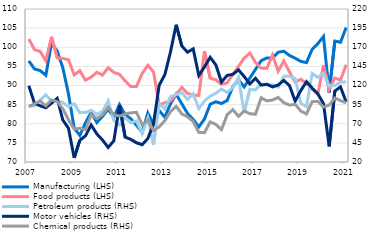
| Category | Manufacturing (LHS) | Food products (LHS) |
|---|---|---|
| 2007 | 96.427 | 102.153 |
| II | 94.327 | 99.364 |
| III | 93.9 | 98.904 |
| IV | 92.682 | 96.417 |
| 2008 | 100.969 | 102.741 |
| II | 99.031 | 97.259 |
| III | 94.635 | 97.109 |
| IV | 87.766 | 96.715 |
| 2009 | 78.923 | 92.764 |
| II | 76.927 | 93.876 |
| III | 80.273 | 91.367 |
| IV | 82.995 | 92.186 |
| 2010 | 80.321 | 93.462 |
| II | 81.929 | 92.737 |
| III | 83.822 | 94.65 |
| IV | 81.702 | 93.434 |
| 2011 | 85.031 | 92.939 |
| II | 82.353 | 91.191 |
| III | 81.307 | 89.747 |
| IV | 79.595 | 89.752 |
| 2012 | 77.737 | 93.154 |
| II | 82.81 | 95.294 |
| III | 79.836 | 93.556 |
| IV | 83.455 | 84.956 |
| 2013 | 81.697 | 85.466 |
| II | 85.208 | 85.966 |
| III | 87.729 | 87.693 |
| IV | 85.199 | 89.509 |
| 2014 | 82.71 | 87.919 |
| II | 81.127 | 87.555 |
| III | 79.166 | 87.381 |
| IV | 81.263 | 98.993 |
| 2015 | 85.102 | 91.914 |
| II | 85.756 | 91.502 |
| III | 85.287 | 90.314 |
| IV | 86.087 | 90.709 |
| 2016 | 89.694 | 92.906 |
| II | 91.518 | 94.986 |
| III | 89.623 | 97.172 |
| IV | 91.945 | 98.494 |
| 2017 | 94.228 | 96.032 |
| II | 96.483 | 94.548 |
| III | 97.201 | 94.479 |
| IV | 97.131 | 97.956 |
| 2018 | 98.696 | 93.722 |
| II | 98.953 | 96.403 |
| III | 97.861 | 93.539 |
| IV | 97.135 | 90.876 |
| 2019 | 96.293 | 91.63 |
| II | 95.999 | 90.541 |
| III | 99.472 | 89.031 |
| IV | 100.947 | 87.728 |
| 2020 | 102.797 | 95.288 |
| II | 88.178 | 88.984 |
| III | 101.606 | 91.978 |
| IV | 101.309 | 91.42 |
| 2021 | 105.153 | 95.422 |